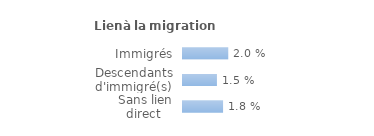
| Category | Series 0 |
|---|---|
| Immigrés | 0.02 |
| Descendants d'immigré(s) | 0.015 |
| Sans lien direct  | 0.018 |